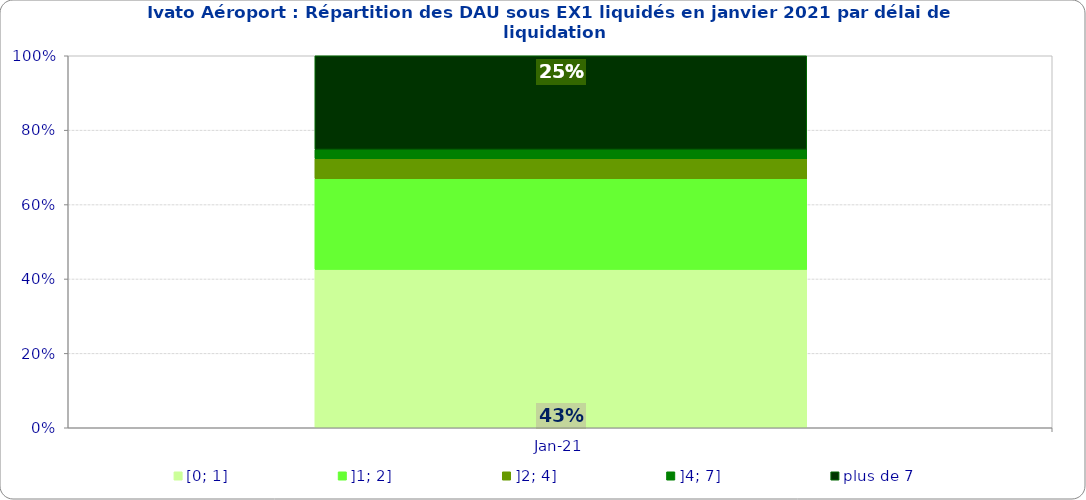
| Category | [0; 1] | ]1; 2] | ]2; 4] | ]4; 7] | plus de 7 |
|---|---|---|---|---|---|
| 2021-01-01 | 0.426 | 0.244 | 0.054 | 0.025 | 0.252 |